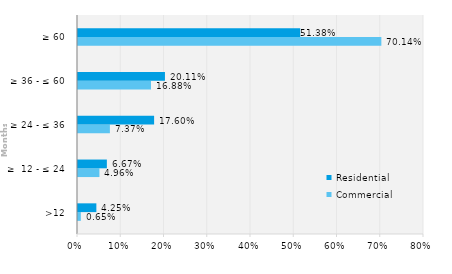
| Category | Commercial | Residential |
|---|---|---|
| >12 | 0.007 | 0.042 |
| ≥  12 - ≤ 24 | 0.05 | 0.067 |
| ≥ 24 - ≤ 36 | 0.074 | 0.176 |
| ≥ 36 - ≤ 60 | 0.169 | 0.201 |
| ≥ 60 | 0.701 | 0.514 |